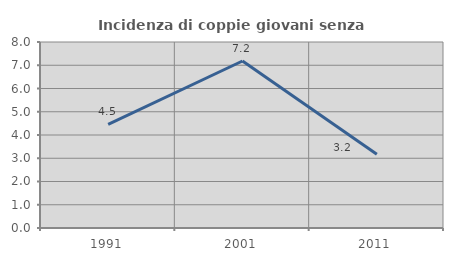
| Category | Incidenza di coppie giovani senza figli |
|---|---|
| 1991.0 | 4.459 |
| 2001.0 | 7.182 |
| 2011.0 | 3.175 |